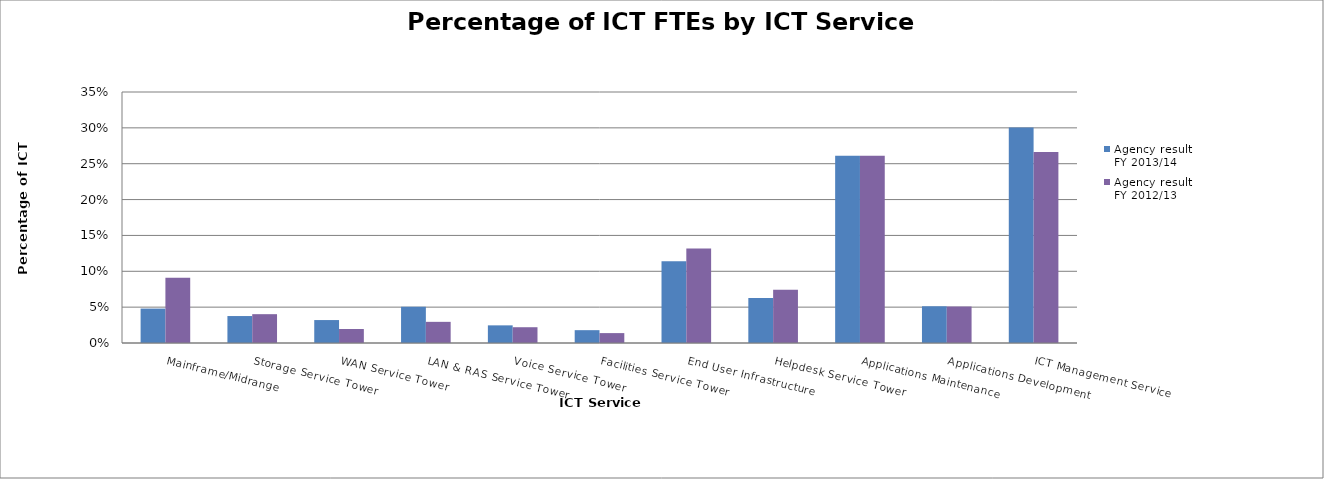
| Category | Agency result 
FY 2013/14 | Agency result 
FY 2012/13 |
|---|---|---|
| Mainframe/Midrange | 0.048 | 0.091 |
| Storage Service Tower | 0.038 | 0.04 |
| WAN Service Tower | 0.032 | 0.02 |
| LAN & RAS Service Tower | 0.05 | 0.03 |
| Voice Service Tower | 0.025 | 0.022 |
| Facilities Service Tower | 0.018 | 0.014 |
| End User Infrastructure | 0.114 | 0.132 |
| Helpdesk Service Tower | 0.063 | 0.074 |
| Applications Maintenance | 0.261 | 0.261 |
| Applications Development | 0.051 | 0.051 |
| ICT Management Service | 0.3 | 0.266 |